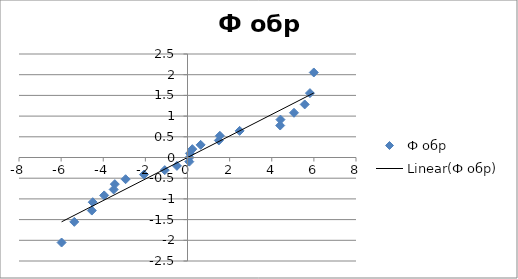
| Category | Ф обр |
|---|---|
| -5.9779421310354905 | -2.054 |
| -5.375256086462542 | -1.555 |
| -4.5426624134885145 | -1.282 |
| -4.499033299423843 | -1.08 |
| -3.9564383820627995 | -0.915 |
| -3.503830638102187 | -0.772 |
| -3.4505903808933738 | -0.643 |
| -2.939235909490918 | -0.524 |
| -2.067232806527187 | -0.412 |
| -1.0792689378298803 | -0.305 |
| -0.503501076580406 | -0.202 |
| 0.08594035034599301 | -0.1 |
| 0.09410343463221693 | 0 |
| 0.11709834776141292 | 0.1 |
| 0.22912840052890715 | 0.202 |
| 0.623705019515171 | 0.305 |
| 1.4883707225383773 | 0.412 |
| 1.5361144823274486 | 0.524 |
| 2.474936427908588 | 0.643 |
| 4.401786394266253 | 0.772 |
| 4.413644069899618 | 0.915 |
| 5.056827670535199 | 1.08 |
| 5.5650550548957085 | 1.282 |
| 5.812428203248885 | 1.555 |
| 5.995853483493221 | 2.054 |